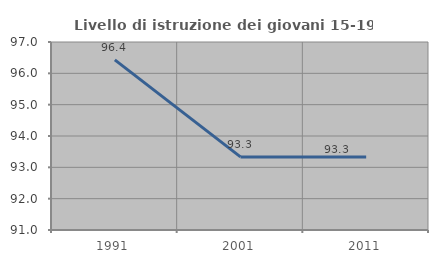
| Category | Livello di istruzione dei giovani 15-19 anni |
|---|---|
| 1991.0 | 96.429 |
| 2001.0 | 93.333 |
| 2011.0 | 93.333 |